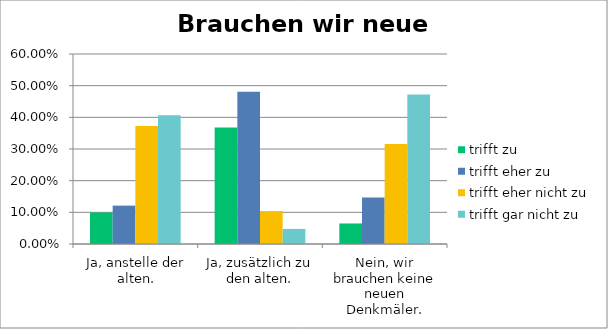
| Category | trifft zu | trifft eher zu | trifft eher nicht zu | trifft gar nicht zu |
|---|---|---|---|---|
| Ja, anstelle der alten. | 0.1 | 0.121 | 0.372 | 0.407 |
| Ja, zusätzlich zu den alten. | 0.368 | 0.48 | 0.104 | 0.048 |
| Nein, wir brauchen keine neuen Denkmäler. | 0.065 | 0.147 | 0.316 | 0.472 |